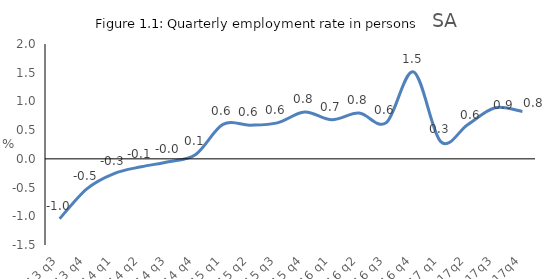
| Category | Series 0 |
|---|---|
| 2013 q3 | -1.044 |
| 2013 q4 | -0.522 |
| 2014 q1 | -0.255 |
| 2014 q2 | -0.138 |
| 2014 q3 | -0.05 |
| 2014 q4 | 0.077 |
| 2015 q1 | 0.6 |
| 2015 q2 | 0.587 |
| 2015 q3 | 0.627 |
| 2015 q4 | 0.815 |
| 2016 q1 | 0.679 |
| 2016 q2 | 0.797 |
| 2016 q3 | 0.63 |
| 2016 q4 | 1.514 |
| 2017 q1 | 0.3 |
| 2017q2 | 0.6 |
| 2017q3 | 0.89 |
| 2017q4 | 0.825 |